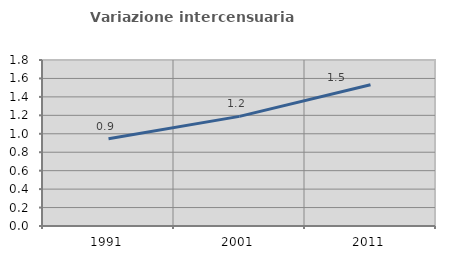
| Category | Variazione intercensuaria annua |
|---|---|
| 1991.0 | 0.947 |
| 2001.0 | 1.189 |
| 2011.0 | 1.531 |